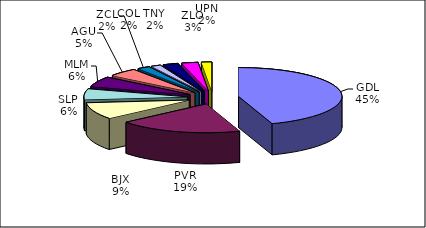
| Category | Series 0 |
|---|---|
| GDL | 82525 |
| PVR | 35694 |
| BJX | 17377 |
| SLP | 11173 |
| MLM | 10573 |
| AGU | 8585 |
| ZCL | 3677 |
| COL | 2794 |
| TNY | 4412 |
| ZLO | 4725 |
| UPN | 2959 |